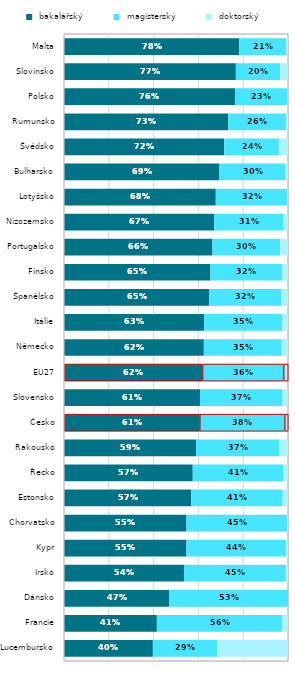
| Category |  bakalářský |  magisterský |  doktorský |
|---|---|---|---|
| Lucembursko | 0.397 | 0.289 | 0.314 |
| Francie | 0.415 | 0.559 | 0.026 |
| Dánsko | 0.471 | 0.529 | 0 |
| Irsko | 0.536 | 0.454 | 0.01 |
| Kypr | 0.547 | 0.444 | 0.009 |
| Chorvatsko | 0.547 | 0.449 | 0.004 |
| Estonsko | 0.568 | 0.408 | 0.024 |
| Řecko | 0.575 | 0.406 | 0.02 |
| Rakousko | 0.59 | 0.372 | 0.039 |
| Česko | 0.605 | 0.379 | 0.015 |
| Slovensko | 0.607 | 0.368 | 0.024 |
| EU27 | 0.618 | 0.362 | 0.02 |
| Německo | 0.624 | 0.348 | 0.028 |
| Itálie | 0.626 | 0.349 | 0.026 |
| Španělsko | 0.648 | 0.324 | 0.028 |
| Finsko | 0.654 | 0.321 | 0.025 |
| Portugalsko | 0.663 | 0.302 | 0.035 |
| Nizozemsko | 0.67 | 0.311 | 0.019 |
| Lotyšsko | 0.678 | 0.319 | 0.003 |
| Bulharsko | 0.694 | 0.296 | 0.01 |
| Švédsko | 0.715 | 0.244 | 0.041 |
| Rumunsko | 0.733 | 0.258 | 0.009 |
| Polsko | 0.763 | 0.235 | 0.002 |
| Slovinsko | 0.767 | 0.198 | 0.034 |
| Malta | 0.782 | 0.209 | 0.009 |